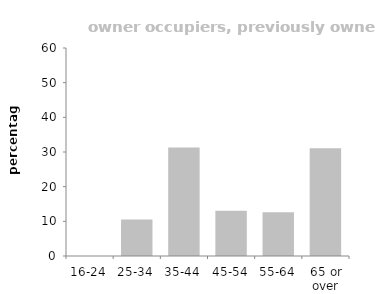
| Category | owner occupiers moving into another owner occupier property |
|---|---|
| 16-24 | 0 |
| 25-34 | 10.512 |
| 35-44 | 31.295 |
| 45-54 | 13.018 |
| 55-64 | 12.609 |
| 65 or over | 31.061 |